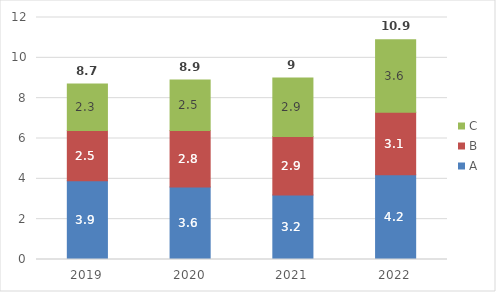
| Category | A | B | C |
|---|---|---|---|
| 2019.0 | 3.9 | 2.5 | 2.3 |
| 2020.0 | 3.6 | 2.8 | 2.5 |
| 2021.0 | 3.2 | 2.9 | 2.9 |
| 2022.0 | 4.2 | 3.1 | 3.6 |